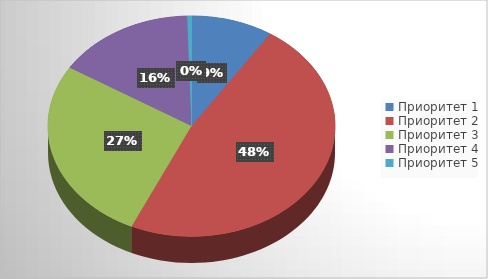
| Category | Series 0 |
|---|---|
| Приоритет 1 | 119710 |
| Приоритет 2 | 619700 |
| Приоритет 3 | 351835 |
| Приоритет 4 | 203150 |
| Приоритет 5 | 6365 |